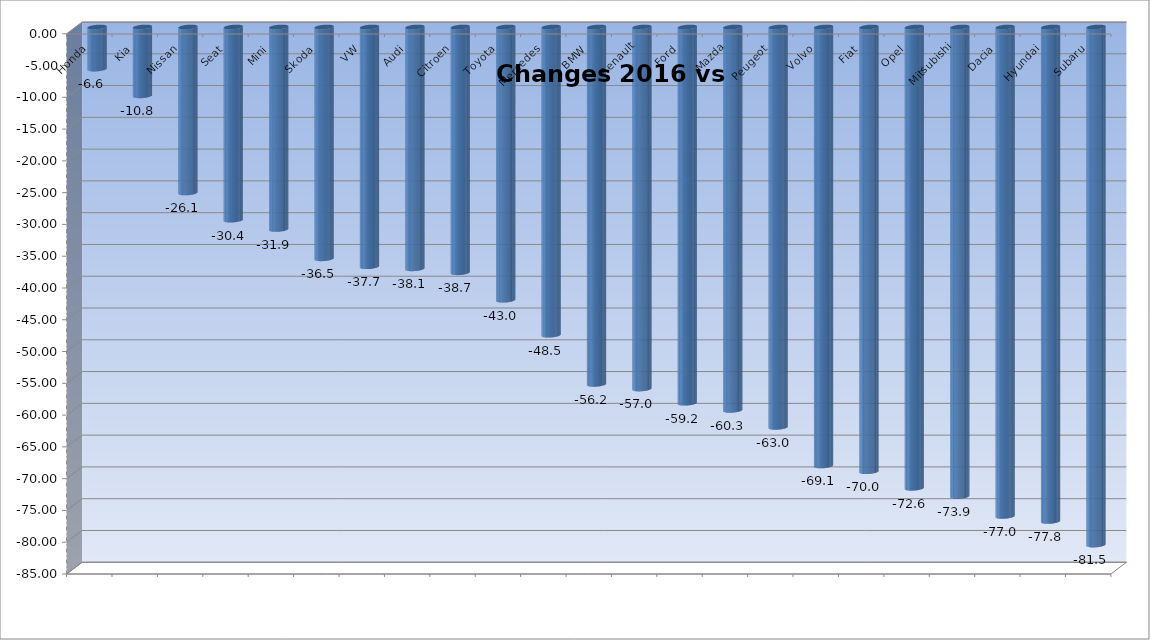
| Category | Ytd 2015 |
|---|---|
| Honda | -6.627 |
| Kia | -10.836 |
| Nissan | -26.118 |
| Seat | -30.396 |
| Mini | -31.863 |
| Skoda | -36.473 |
| VW | -37.719 |
| Audi | -38.054 |
| Citroen | -38.671 |
| Toyota | -42.99 |
| Mercedes | -48.494 |
| BMW | -56.236 |
| Renault | -56.962 |
| Ford | -59.201 |
| Mazda | -60.326 |
| Peugeot | -63.003 |
| Volvo | -69.065 |
| Fiat | -69.974 |
| Opel | -72.588 |
| Mitsubishi | -73.885 |
| Dacia | -77.011 |
| Hyundai | -77.801 |
| Subaru | -81.513 |